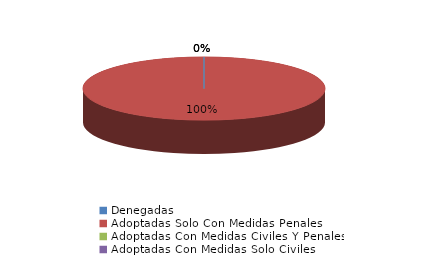
| Category | Series 0 |
|---|---|
| Denegadas | 0 |
| Adoptadas Solo Con Medidas Penales | 8 |
| Adoptadas Con Medidas Civiles Y Penales | 0 |
| Adoptadas Con Medidas Solo Civiles | 0 |